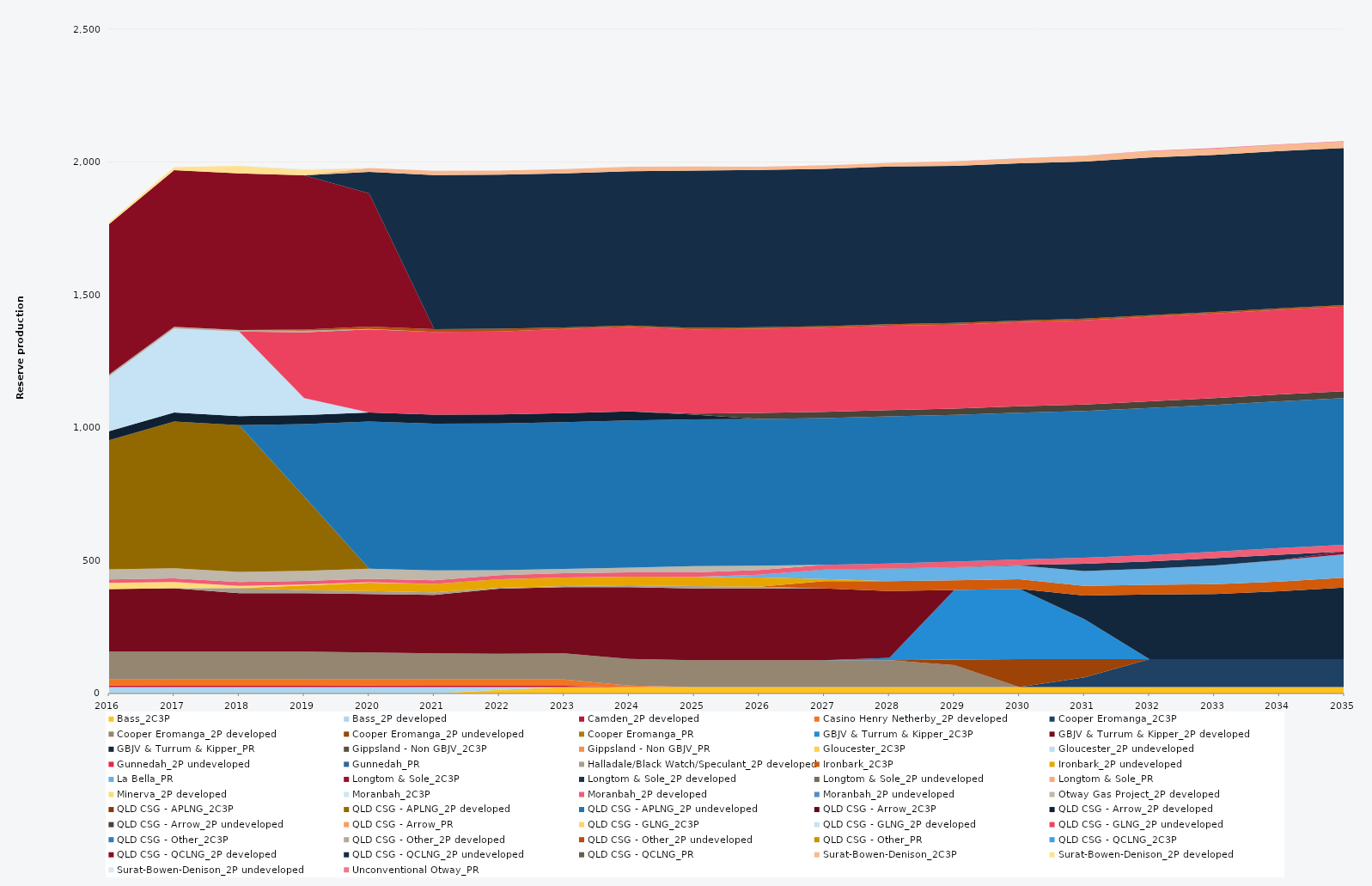
| Category | Bass_2C3P | Bass_2P developed | Camden_2P developed | Casino Henry Netherby_2P developed | Cooper Eromanga_2C3P | Cooper Eromanga_2P developed | Cooper Eromanga_2P undeveloped | Cooper Eromanga_PR | GBJV & Turrum & Kipper_2C3P | GBJV & Turrum & Kipper_2P developed | GBJV & Turrum & Kipper_PR | Gippsland - Non GBJV_2C3P | Gippsland - Non GBJV_PR | Gloucester_2C3P | Gloucester_2P undeveloped | Gunnedah_2P undeveloped | Gunnedah_PR | Halladale/Black Watch/Speculant_2P developed | Ironbark_2C3P | Ironbark_2P undeveloped | La Bella_PR | Longtom & Sole_2C3P | Longtom & Sole_2P developed | Longtom & Sole_2P undeveloped | Longtom & Sole_PR | Minerva_2P developed | Moranbah_2C3P | Moranbah_2P developed | Moranbah_2P undeveloped | Otway Gas Project_2P developed | QLD CSG - APLNG_2C3P | QLD CSG - APLNG_2P developed | QLD CSG - APLNG_2P undeveloped | QLD CSG - Arrow_2C3P | QLD CSG - Arrow_2P developed | QLD CSG - Arrow_2P undeveloped | QLD CSG - Arrow_PR | QLD CSG - GLNG_2C3P | QLD CSG - GLNG_2P developed | QLD CSG - GLNG_2P undeveloped | QLD CSG - Other_2C3P | QLD CSG - Other_2P developed | QLD CSG - Other_2P undeveloped | QLD CSG - Other_PR | QLD CSG - QCLNG_2C3P | QLD CSG - QCLNG_2P developed | QLD CSG - QCLNG_2P undeveloped | QLD CSG - QCLNG_PR | Surat-Bowen-Denison_2C3P | Surat-Bowen-Denison_2P developed | Surat-Bowen-Denison_2P undeveloped | Unconventional Otway_PR |
|---|---|---|---|---|---|---|---|---|---|---|---|---|---|---|---|---|---|---|---|---|---|---|---|---|---|---|---|---|---|---|---|---|---|---|---|---|---|---|---|---|---|---|---|---|---|---|---|---|---|---|---|---|
| 2016 | 0 | 24.522 | 5 | 23.12 | 0 | 105 | 0 | 0 | 0 | 235.041 | 0 | 0 | 0 | 0 | 0 | 0 | 0 | 0 | 0 | 0 | 0 | 0 | 0 | 0 | 0 | 23.79 | 0 | 13.077 | 0 | 38 | 0 | 485.346 | 0 | 0 | 34.038 | 0 | 0 | 0 | 207.654 | 0 | 0 | 5.856 | 0 | 0 | 0 | 565.857 | 0 | 0 | 0 | 7.85 | 0 | 0 |
| 2017 | 0 | 24.455 | 5 | 23.12 | 0 | 105 | 0 | 0 | 0 | 238.456 | 0 | 0 | 0 | 0 | 0 | 0 | 0 | 0 | 0 | 0 | 0 | 0 | 0 | 0 | 0 | 23.725 | 0 | 13.709 | 0 | 38 | 0 | 552.245 | 0 | 0 | 33.945 | 0 | 0 | 0 | 316.298 | 0 | 0 | 5.84 | 0 | 0 | 0 | 590.153 | 0 | 0 | 0 | 10.764 | 0 | 0 |
| 2018 | 0 | 24.455 | 5 | 23.12 | 0 | 105 | 0 | 0 | 0 | 220 | 0 | 0 | 0 | 0 | 0 | 0 | 0 | 19.157 | 0 | 0 | 0 | 0 | 0 | 0 | 0 | 8.546 | 0 | 14.12 | 0 | 38 | 0 | 552.245 | 0 | 0 | 33.945 | 0 | 0 | 0 | 318.905 | 0 | 0 | 5.84 | 0 | 0 | 0 | 589.223 | 0 | 0 | 0 | 28.204 | 0 | 0 |
| 2019 | 0 | 24.455 | 5 | 23.12 | 0 | 105 | 0 | 0 | 0 | 220 | 0 | 0 | 0 | 0 | 0 | 0 | 0 | 10.95 | 0 | 18.25 | 0 | 0 | 0 | 0 | 0 | 3.197 | 0 | 13.353 | 0 | 38 | 0 | 279.714 | 272.531 | 0 | 33.945 | 0 | 0 | 0 | 64.443 | 247.473 | 0 | 5.84 | 4.563 | 0 | 0 | 580.594 | 0 | 0 | 0.32 | 19.997 | 2 | 0 |
| 2020 | 0 | 24.522 | 5 | 23.12 | 0 | 101.757 | 0 | 0 | 0 | 220 | 0 | 0 | 0 | 0 | 0 | 0 | 0 | 10.95 | 0 | 31.776 | 0 | 0 | 0 | 0 | 0 | 1.492 | 0 | 13.322 | 0 | 38 | 0 | 0 | 553.758 | 0 | 34.038 | 0 | 0 | 0 | 0 | 312.746 | 0 | 1.624 | 8.795 | 0 | 0 | 501.573 | 80.835 | 0 | 14.779 | 0 | 0 | 0 |
| 2021 | 0 | 24.455 | 5 | 23.12 | 0 | 98.579 | 0 | 0 | 0 | 220 | 0 | 0 | 0 | 0 | 0 | 0 | 0 | 9.948 | 0 | 31.317 | 0 | 0 | 0 | 0 | 0 | 0 | 0 | 13.827 | 0 | 36.643 | 0 | 0 | 552.245 | 0 | 33.945 | 0 | 0 | 0 | 0 | 311.831 | 0 | 0 | 10.403 | 0 | 0 | 0 | 579.753 | 0 | 15.887 | 0 | 0 | 0 |
| 2022 | 13.672 | 10.783 | 5 | 23.12 | 0 | 97.216 | 0 | 0 | 0 | 244.607 | 0 | 0 | 0 | 0 | 0 | 0 | 0 | 3.556 | 0 | 32.138 | 0 | 0 | 0 | 0 | 0 | 0 | 0 | 15.298 | 0 | 19.09 | 0 | 0 | 552.245 | 0 | 33.945 | 0 | 0 | 0 | 0 | 311.898 | 0 | 0 | 10.403 | 0 | 0 | 0 | 579.606 | 0 | 15.502 | 0 | 0 | 0 |
| 2023 | 24.455 | 0 | 5 | 23.12 | 0 | 98.292 | 0 | 0 | 0 | 249.161 | 0 | 0 | 0 | 0 | 0 | 0 | 0 | 4.291 | 0 | 32.092 | 0 | 0 | 0 | 0 | 0 | 0 | 0 | 16.264 | 0 | 16.579 | 0 | 0 | 552.245 | 0 | 33.945 | 0 | 0 | 0 | 0 | 316.625 | 0 | 0 | 5.84 | 0 | 0 | 0 | 579.587 | 0 | 16.036 | 0 | 0 | 0 |
| 2024 | 24.522 | 0 | 0 | 5.3 | 0 | 100.02 | 0 | 0 | 0 | 270 | 0 | 0 | 0 | 0 | 0 | 0 | 0 | 7.855 | 0 | 31.833 | 0 | 0 | 0 | 0 | 0 | 0 | 0 | 16.79 | 0 | 17.779 | 0 | 0 | 553.758 | 0 | 34.038 | 0 | 0 | 0 | 0 | 317.359 | 0 | 0 | 5.856 | 0 | 0 | 0 | 580.592 | 0 | 16.464 | 0 | 0 | 0 |
| 2025 | 24.455 | 0 | 0 | 0 | 0 | 101.039 | 0 | 0 | 0 | 270 | 0 | 0 | 0 | 0 | 0 | 0 | 0 | 8.865 | 0 | 34.683 | 0 | 0 | 0 | 0 | 0 | 0 | 0 | 17.268 | 0 | 23.158 | 0 | 0 | 552.245 | 0 | 18.166 | 3.869 | 0 | 0 | 0 | 316.795 | 0 | 0 | 5.84 | 0 | 0 | 0 | 591.794 | 0 | 15.115 | 0 | 0 | 0 |
| 2026 | 24.455 | 0 | 0 | 0 | 0 | 100.577 | 0 | 0 | 0 | 270 | 0 | 0 | 0 | 0 | 0 | 0 | 0 | 6.428 | 0 | 35.404 | 10.23 | 0 | 0.185 | 0 | 0 | 0 | 0 | 17.518 | 0 | 16.358 | 0 | 0 | 552.245 | 0 | 0 | 22.841 | 0 | 0 | 0 | 316.693 | 0 | 0 | 5.84 | 0 | 0 | 0 | 591.753 | 0 | 12.395 | 0 | 0 | 0 |
| 2027 | 24.455 | 0 | 0 | 0 | 0 | 100.606 | 0 | 0 | 0 | 270 | 0 | 0 | 0 | 0 | 0 | 0 | 0 | 0 | 27.51 | 8.507 | 34.939 | 0 | 0.225 | 0 | 0 | 0 | 0 | 18.14 | 0 | 0 | 0 | 0 | 552.245 | 0 | 0 | 23.131 | 0 | 0 | 0 | 316.854 | 0 | 0 | 5.84 | 0 | 0 | 0 | 591.693 | 0 | 12.418 | 0 | 0 | 0.649 |
| 2028 | 24.522 | 0 | 0 | 0 | 0 | 100.844 | 0 | 0 | 8.77 | 251.842 | 0 | 0 | 0 | 0 | 0 | 0 | 0 | 0 | 36.6 | 0 | 47.563 | 0 | 0.21 | 0 | 0 | 0 | 0 | 18.99 | 0 | 0 | 0 | 0 | 553.758 | 0 | 0 | 23.47 | 0 | 0 | 0 | 317.828 | 0 | 0 | 5.856 | 0 | 0 | 0 | 593.234 | 0 | 13.255 | 0 | 0 | 0.436 |
| 2029 | 24.455 | 0 | 0 | 0 | 0 | 82.071 | 20.94 | 0 | 262.304 | 0 | 0 | 0 | 0 | 0 | 0 | 0 | 0 | 0 | 36.5 | 0 | 48 | 0 | 1.542 | 0 | 0 | 0 | 0 | 20.344 | 0 | 0 | 0 | 0 | 552.245 | 0 | 0 | 23.353 | 0 | 0 | 0 | 316.897 | 0 | 0 | 5.84 | 0 | 0 | 0 | 591.622 | 0 | 15.776 | 0 | 0 | 0.729 |
| 2030 | 24.455 | 0 | 0 | 0 | 0 | 0 | 105 | 0 | 264.048 | 0 | 0 | 0 | 0 | 0 | 0 | 0 | 0 | 0 | 36.5 | 0 | 51.626 | 0 | 1.592 | 0 | 0 | 0 | 0 | 21.608 | 0 | 0 | 0 | 0 | 552.245 | 0 | 0 | 23.602 | 0 | 0 | 0 | 317.279 | 0 | 0 | 5.84 | 0 | 0 | 0 | 591.579 | 0 | 17.949 | 0 | 0 | 0.653 |
| 2031 | 24.455 | 0 | 0 | 0 | 36.358 | 0 | 68.642 | 0 | 150.592 | 0 | 88.823 | 0 | 0 | 0 | 0 | 0 | 0 | 0 | 36.5 | 0 | 55.418 | 0 | 27.375 | 0 | 0 | 0 | 0 | 22.555 | 0 | 0 | 0 | 0 | 552.245 | 0 | 0 | 24.176 | 0 | 0 | 0 | 317.559 | 0 | 0 | 5.84 | 0 | 0 | 0 | 591.53 | 0 | 20.6 | 0 | 0 | 1.116 |
| 2032 | 24.522 | 0 | 0 | 0 | 105 | 0 | 0 | 0 | 0 | 0 | 242.918 | 0 | 0 | 0 | 0 | 0 | 0 | 0 | 36.6 | 0 | 60.656 | 0 | 27.45 | 0 | 0 | 0 | 0 | 23.473 | 0 | 0 | 0 | 0 | 553.758 | 0 | 0 | 25.27 | 0 | 0 | 0 | 318.687 | 0 | 0 | 5.856 | 0 | 0 | 0 | 593.07 | 0 | 23.715 | 0 | 0 | 1.639 |
| 2033 | 24.455 | 0 | 0 | 0 | 105 | 0 | 0 | 0 | 0 | 0 | 245.205 | 0 | 0 | 0 | 0 | 0 | 0 | 0 | 36.5 | 0 | 70.748 | 0 | 27.375 | 0 | 0 | 0 | 0 | 23.984 | 0 | 0 | 0 | 0 | 552.245 | 0 | 0 | 26.292 | 0 | 0 | 0 | 318.155 | 0 | 0 | 5.84 | 0 | 0 | 0 | 591.435 | 0 | 22.674 | 0 | 0 | 2.618 |
| 2034 | 24.455 | 0 | 0 | 0 | 105 | 0 | 0 | 0 | 0 | 0 | 255.21 | 0 | 0 | 0 | 0 | 0 | 0 | 0 | 36.5 | 0 | 80.406 | 0.375 | 20.527 | 0 | 0 | 0 | 0 | 24.559 | 0 | 0 | 0 | 0 | 552.245 | 0 | 0 | 26.478 | 0 | 0 | 0 | 318.338 | 0 | 0 | 5.84 | 0 | 0 | 0 | 591.394 | 0 | 23.82 | 0 | 0 | 1.368 |
| 2035 | 24.455 | 0 | 0 | 0 | 105 | 0 | 0 | 0 | 0 | 0 | 269.734 | 0 | 0 | 0 | 0 | 0 | 0 | 0 | 36.5 | 0 | 88.768 | 10.215 | 0 | 0 | 0 | 0 | 0 | 24.812 | 0 | 0 | 0 | 0 | 552.245 | 0 | 0 | 26.393 | 0 | 0 | 0 | 317.822 | 0 | 0 | 5.84 | 0 | 0 | 0 | 591.053 | 0 | 23.995 | 0 | 0 | 1.791 |